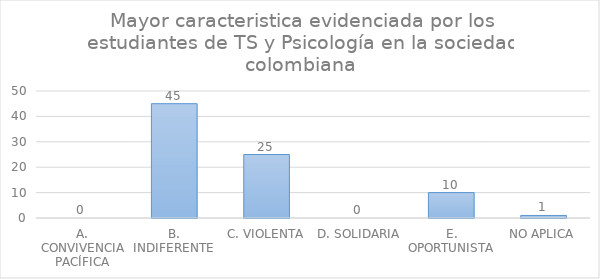
| Category | Series 0 |
|---|---|
| A. CONVIVENCIA PACÍFICA | 0 |
| B. INDIFERENTE  | 45 |
| C. VIOLENTA | 25 |
| D. SOLIDARIA | 0 |
| E. OPORTUNISTA | 10 |
| NO APLICA | 1 |